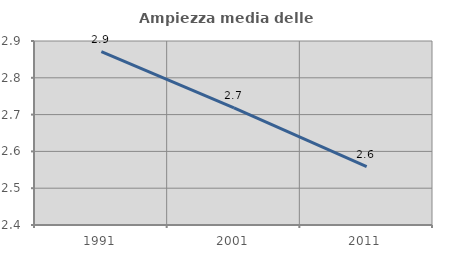
| Category | Ampiezza media delle famiglie |
|---|---|
| 1991.0 | 2.871 |
| 2001.0 | 2.719 |
| 2011.0 | 2.559 |